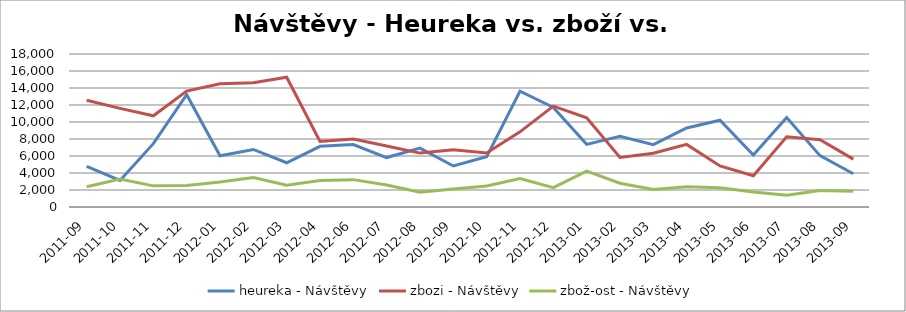
| Category | heureka - Návštěvy | zbozi - Návštěvy | zbož-ost - Návštěvy |
|---|---|---|---|
| 2011-09 | 4787.129 | 12550.575 | 2385.488 |
| 2011-10 | 3122.255 | 11601.197 | 3301.291 |
| 2011-11 | 7449.906 | 10727.34 | 2487.969 |
| 2011-12 | 13210.921 | 13638.345 | 2534.103 |
| 2012-01 | 6026.606 | 14503.172 | 2929.729 |
| 2012-02 | 6769.356 | 14624.463 | 3466.22 |
| 2012-03 | 5207.045 | 15264.892 | 2555.401 |
| 2012-04 | 7136.656 | 7720.322 | 3115.365 |
| 2012-06 | 7346.062 | 7988.178 | 3218.629 |
| 2012-07 | 5816.214 | 7167.722 | 2576.575 |
| 2012-08 | 6926.019 | 6341.146 | 1747.419 |
| 2012-09 | 4822.278 | 6731.961 | 2112.802 |
| 2012-10 | 5912.896 | 6349.073 | 2474.63 |
| 2012-11 | 13615.789 | 8844.352 | 3359.24 |
| 2012-12 | 11717.173 | 11866.135 | 2272.628 |
| 2013-01 | 7368.008 | 10487.893 | 4211.254 |
| 2013-02 | 8325.64 | 5829.646 | 2791.446 |
| 2013-03 | 7341.524 | 6314.832 | 2049.26 |
| 2013-04 | 9293.074 | 7363.09 | 2387.489 |
| 2013-05 | 10212.518 | 4828.89 | 2259.63 |
| 2013-06 | 6119.961 | 3675.315 | 1766.967 |
| 2013-07 | 10523.392 | 8257.311 | 1372.442 |
| 2013-08 | 6043.098 | 7921.208 | 1950.489 |
| 2013-09 | 3907.24 | 5627.561 | 1859.837 |